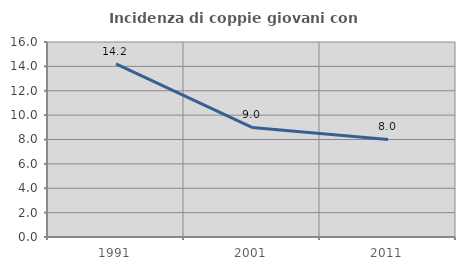
| Category | Incidenza di coppie giovani con figli |
|---|---|
| 1991.0 | 14.198 |
| 2001.0 | 8.99 |
| 2011.0 | 8.008 |